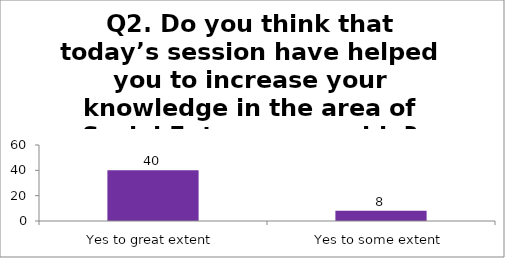
| Category | Q2. Do you think that today’s session have helped you to increase your knowledge in the area of Social Entrepreneurship? |
|---|---|
| Yes to great extent | 40 |
| Yes to some extent | 8 |